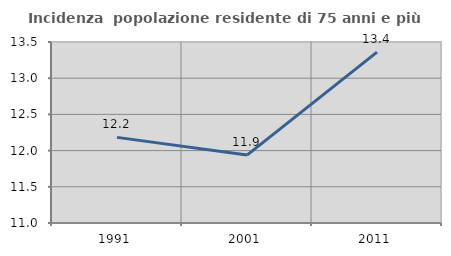
| Category | Incidenza  popolazione residente di 75 anni e più |
|---|---|
| 1991.0 | 12.183 |
| 2001.0 | 11.938 |
| 2011.0 | 13.361 |